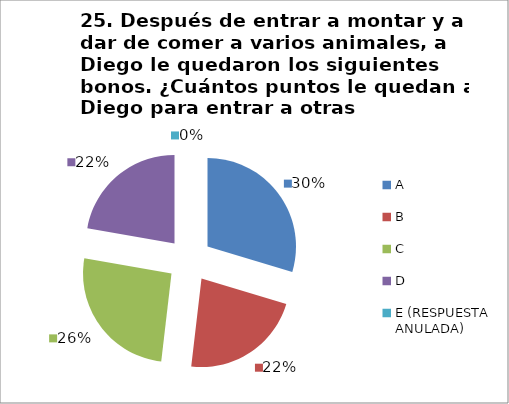
| Category | CANTIDAD DE RESPUESTAS PREGUNTA (25) | PORCENTAJE |
|---|---|---|
| A | 8 | 0.296 |
| B | 6 | 0.222 |
| C | 7 | 0.259 |
| D | 6 | 0.222 |
| E (RESPUESTA ANULADA) | 0 | 0 |